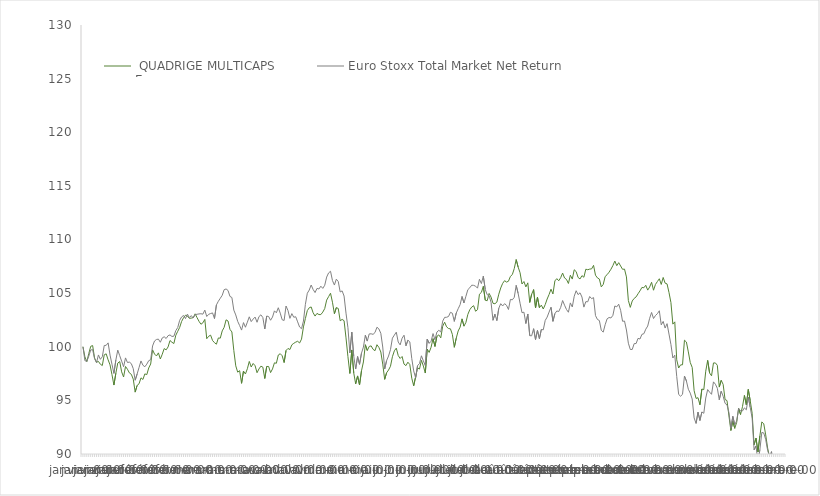
| Category |   QUADRIGE MULTICAPS
Europe  |  Euro Stoxx Total Market Net Return  |
|---|---|---|
| 0 | 100 | 100 |
| 1900-01-01 | 99.06 | 98.703 |
| 1900-01-02 | 98.61 | 98.641 |
| 1900-01-03 | 99.36 | 99.115 |
| 1900-01-04 | 100.04 | 99.701 |
| 1900-01-05 | 100.11 | 99.733 |
| 1900-01-06 | 98.95 | 98.884 |
| 1900-01-07 | 98.56 | 98.515 |
| 1900-01-08 | 98.63 | 99.237 |
| 1900-01-09 | 98.37 | 98.828 |
| 1900-01-10 | 98.25 | 99.066 |
| 1900-01-11 | 99.25 | 100.118 |
| 1900-01-12 | 99.34 | 100.132 |
| 1900-01-13 | 98.78 | 100.36 |
| 1900-01-14 | 98.31 | 99.224 |
| 1900-01-15 | 97.4 | 98.368 |
| 1900-01-16 | 96.43 | 97.516 |
| 1900-01-17 | 97.53 | 98.762 |
| 1900-01-18 | 98.48 | 99.688 |
| 1900-01-19 | 98.62 | 99.167 |
| 1900-01-20 | 97.66 | 98.655 |
| 1900-01-21 | 97.18 | 98.136 |
| 1900-01-22 | 98.16 | 98.96 |
| 1900-01-23 | 97.9 | 98.532 |
| 1900-01-24 | 97.56 | 98.568 |
| 1900-01-25 | 97.43 | 98.426 |
| 1900-01-26 | 96.98 | 97.956 |
| 1900-01-27 | 95.77 | 96.879 |
| 1900-01-28 | 96.39 | 97.457 |
| 1900-01-29 | 96.55 | 98.07 |
| 1900-01-30 | 97.1 | 98.676 |
| 1900-01-31 | 96.95 | 98.273 |
| 1900-02-01 | 97.47 | 98.135 |
| 1900-02-02 | 97.4 | 98.378 |
| 1900-02-03 | 98.02 | 98.701 |
| 1900-02-04 | 98.39 | 98.793 |
| 1900-02-05 | 99.71 | 100.074 |
| 1900-02-06 | 99.32 | 100.537 |
| 1900-02-07 | 99.14 | 100.678 |
| 1900-02-08 | 99.43 | 100.711 |
| 1900-02-09 | 98.86 | 100.421 |
| 1900-02-10 | 99.3 | 100.822 |
| 1900-02-11 | 99.83 | 100.93 |
| 1900-02-12 | 99.71 | 100.767 |
| 1900-02-13 | 99.98 | 101.032 |
| 1900-02-14 | 100.58 | 101.103 |
| 1900-02-15 | 100.42 | 100.959 |
| 1900-02-16 | 100.3 | 100.984 |
| 1900-02-17 | 101.07 | 101.507 |
| 1900-02-18 | 101.44 | 101.791 |
| 1900-02-19 | 101.8 | 102.463 |
| 1900-02-20 | 102.36 | 102.781 |
| 1900-02-21 | 102.7 | 102.917 |
| 1900-02-22 | 102.94 | 102.624 |
| 1900-02-23 | 102.87 | 103.045 |
| 1900-02-24 | 102.65 | 102.719 |
| 1900-02-25 | 102.67 | 102.903 |
| 1900-02-26 | 102.71 | 102.68 |
| 1900-02-27 | 103.07 | 102.993 |
| 1900-02-28 | 102.71 | 103.029 |
| 1900-02-28 | 102.37 | 103.062 |
| 1900-03-01 | 102.1 | 103.077 |
| 1900-03-02 | 102.23 | 103.04 |
| 1900-03-03 | 102.55 | 103.417 |
| 1900-03-04 | 100.75 | 102.821 |
| 1900-03-05 | 100.98 | 103.023 |
| 1900-03-06 | 101.08 | 103.097 |
| 1900-03-07 | 100.58 | 103.153 |
| 1900-03-08 | 100.38 | 102.63 |
| 1900-03-09 | 100.24 | 103.903 |
| 1900-03-10 | 100.82 | 104.241 |
| 1900-03-11 | 100.8 | 104.52 |
| 1900-03-12 | 101.48 | 104.8 |
| 1900-03-13 | 101.81 | 105.323 |
| 1900-03-14 | 102.51 | 105.388 |
| 1900-03-15 | 102.4 | 105.248 |
| 1900-03-16 | 101.62 | 104.693 |
| 1900-03-17 | 101.38 | 104.593 |
| 1900-03-18 | 99.65 | 103.417 |
| 1900-03-19 | 98.22 | 102.965 |
| 1900-03-20 | 97.63 | 102.366 |
| 1900-03-21 | 97.77 | 101.977 |
| 1900-03-22 | 96.59 | 101.553 |
| 1900-03-23 | 97.73 | 102.25 |
| 1900-03-24 | 97.46 | 101.819 |
| 1900-03-25 | 97.95 | 102.292 |
| 1900-03-26 | 98.63 | 102.79 |
| 1900-03-27 | 98.11 | 102.345 |
| 1900-03-28 | 98.44 | 102.582 |
| 1900-03-29 | 98.23 | 102.767 |
| 1900-03-30 | 97.58 | 102.284 |
| 1900-03-31 | 97.93 | 102.81 |
| 1900-04-01 | 98.19 | 102.976 |
| 1900-04-02 | 98.1 | 102.728 |
| 1900-04-03 | 97.04 | 101.657 |
| 1900-04-04 | 98.16 | 102.863 |
| 1900-04-05 | 98.16 | 102.818 |
| 1900-04-06 | 97.59 | 102.472 |
| 1900-04-07 | 97.93 | 102.767 |
| 1900-04-08 | 98.5 | 103.346 |
| 1900-04-09 | 98.46 | 103.167 |
| 1900-04-10 | 99.23 | 103.637 |
| 1900-04-11 | 99.35 | 103.133 |
| 1900-04-12 | 99.16 | 102.514 |
| 1900-04-13 | 98.53 | 102.452 |
| 1900-04-14 | 99.65 | 103.799 |
| 1900-04-15 | 99.84 | 103.377 |
| 1900-04-16 | 99.74 | 102.646 |
| 1900-04-17 | 100.18 | 103.09 |
| 1900-04-18 | 100.32 | 102.75 |
| 1900-04-19 | 100.43 | 102.798 |
| 1900-04-20 | 100.51 | 102.32 |
| 1900-04-21 | 100.35 | 101.839 |
| 1900-04-22 | 100.71 | 101.684 |
| 1900-04-23 | 101.85 | 102.398 |
| 1900-04-24 | 102.63 | 103.948 |
| 1900-04-25 | 103.37 | 104.989 |
| 1900-04-26 | 103.64 | 105.288 |
| 1900-04-27 | 103.71 | 105.756 |
| 1900-04-28 | 103.17 | 105.34 |
| 1900-04-29 | 102.86 | 105.051 |
| 1900-04-30 | 103.11 | 105.439 |
| 1900-05-01 | 103 | 105.385 |
| 1900-05-02 | 103 | 105.645 |
| 1900-05-03 | 103.23 | 105.442 |
| 1900-05-04 | 103.56 | 105.732 |
| 1900-05-05 | 104.35 | 106.497 |
| 1900-05-06 | 104.67 | 106.884 |
| 1900-05-07 | 104.99 | 107.039 |
| 1900-05-08 | 104.15 | 106.173 |
| 1900-05-09 | 103.08 | 105.754 |
| 1900-05-10 | 103.65 | 106.302 |
| 1900-05-11 | 103.57 | 106.081 |
| 1900-05-12 | 102.42 | 105.105 |
| 1900-05-13 | 102.55 | 105.208 |
| 1900-05-14 | 102.43 | 104.727 |
| 1900-05-15 | 100.83 | 103.133 |
| 1900-05-16 | 99.08 | 101.78 |
| 1900-05-17 | 97.51 | 99.427 |
| 1900-05-18 | 99.7 | 101.361 |
| 1900-05-19 | 97.56 | 99.123 |
| 1900-05-20 | 96.54 | 97.924 |
| 1900-05-21 | 97.28 | 99.089 |
| 1900-05-22 | 96.44 | 98.363 |
| 1900-05-23 | 97.75 | 99.401 |
| 1900-05-24 | 98.58 | 99.971 |
| 1900-05-25 | 100.19 | 101.074 |
| 1900-05-26 | 99.65 | 100.528 |
| 1900-05-27 | 100.03 | 101.196 |
| 1900-05-28 | 100.08 | 101.207 |
| 1900-05-29 | 99.76 | 101.156 |
| 1900-05-30 | 99.63 | 101.33 |
| 1900-05-31 | 100.19 | 101.82 |
| 1900-06-01 | 99.94 | 101.664 |
| 1900-06-02 | 99.51 | 101.252 |
| 1900-06-03 | 98.38 | 99.975 |
| 1900-06-04 | 96.96 | 97.922 |
| 1900-06-05 | 97.58 | 98.714 |
| 1900-06-06 | 97.83 | 99.136 |
| 1900-06-07 | 98.18 | 99.728 |
| 1900-06-08 | 99.07 | 100.802 |
| 1900-06-09 | 99.62 | 101.086 |
| 1900-06-10 | 99.87 | 101.359 |
| 1900-06-11 | 99.18 | 100.438 |
| 1900-06-12 | 98.91 | 100.172 |
| 1900-06-13 | 99.09 | 100.793 |
| 1900-06-14 | 98.38 | 101.075 |
| 1900-06-15 | 98.24 | 100.087 |
| 1900-06-16 | 98.56 | 100.613 |
| 1900-06-17 | 98.34 | 100.452 |
| 1900-06-18 | 97.07 | 98.908 |
| 1900-06-19 | 96.36 | 97.748 |
| 1900-06-20 | 97.2 | 97.1 |
| 1900-06-21 | 98.03 | 98.236 |
| 1900-06-22 | 97.92 | 98.434 |
| 1900-06-23 | 98.73 | 99.157 |
| 1900-06-24 | 98.2 | 98.679 |
| 1900-06-25 | 97.55 | 98.256 |
| 1900-06-26 | 99.79 | 100.714 |
| 1900-06-27 | 99.47 | 100.321 |
| 1900-06-28 | 99.96 | 100.512 |
| 1900-06-29 | 100.76 | 101.229 |
| 1900-06-30 | 100.03 | 100.649 |
| 1900-07-01 | 100.97 | 101.372 |
| 1900-07-02 | 101.11 | 101.533 |
| 1900-07-03 | 100.83 | 101.378 |
| 1900-07-04 | 101.92 | 102.393 |
| 1900-07-05 | 102.29 | 102.739 |
| 1900-07-06 | 101.86 | 102.748 |
| 1900-07-07 | 101.7 | 102.821 |
| 1900-07-08 | 101.67 | 103.211 |
| 1900-07-09 | 101.15 | 103.127 |
| 1900-07-10 | 99.95 | 102.365 |
| 1900-07-11 | 100.8 | 103.141 |
| 1900-07-12 | 101.47 | 103.549 |
| 1900-07-13 | 101.83 | 103.921 |
| 1900-07-14 | 102.6 | 104.689 |
| 1900-07-15 | 101.92 | 104.078 |
| 1900-07-16 | 102.27 | 104.705 |
| 1900-07-17 | 103.02 | 105.324 |
| 1900-07-18 | 103.45 | 105.498 |
| 1900-07-19 | 103.7 | 105.74 |
| 1900-07-20 | 103.83 | 105.725 |
| 1900-07-21 | 103.31 | 105.648 |
| 1900-07-22 | 103.46 | 105.464 |
| 1900-07-23 | 104.9 | 106.291 |
| 1900-07-24 | 105.07 | 105.891 |
| 1900-07-25 | 105.63 | 106.583 |
| 1900-07-26 | 104.34 | 105.347 |
| 1900-07-27 | 104.29 | 104.849 |
| 1900-07-28 | 104.97 | 104.762 |
| 1900-07-29 | 104.63 | 104.142 |
| 1900-07-30 | 104.05 | 102.469 |
| 1900-07-31 | 104.01 | 103.048 |
| 1900-08-01 | 104.16 | 102.436 |
| 1900-08-02 | 104.9 | 103.588 |
| 1900-08-03 | 105.48 | 104.014 |
| 1900-08-04 | 105.91 | 103.802 |
| 1900-08-05 | 106.16 | 104.016 |
| 1900-08-06 | 106.03 | 103.862 |
| 1900-08-07 | 106.11 | 103.474 |
| 1900-08-08 | 106.56 | 104.412 |
| 1900-08-09 | 106.73 | 104.378 |
| 1900-08-10 | 107.29 | 104.606 |
| 1900-08-11 | 108.13 | 105.72 |
| 1900-08-12 | 107.43 | 104.973 |
| 1900-08-13 | 106.9 | 104.058 |
| 1900-08-14 | 105.85 | 103.172 |
| 1900-08-15 | 106.08 | 103.223 |
| 1900-08-16 | 105.58 | 102.165 |
| 1900-08-17 | 105.96 | 103.054 |
| 1900-08-18 | 104.13 | 101.033 |
| 1900-08-19 | 104.9 | 101.021 |
| 1900-08-20 | 105.33 | 101.684 |
| 1900-08-21 | 103.62 | 100.672 |
| 1900-08-22 | 104.62 | 101.529 |
| 1900-08-23 | 103.64 | 100.754 |
| 1900-08-24 | 103.88 | 101.614 |
| 1900-08-25 | 103.52 | 101.577 |
| 1900-08-26 | 103.93 | 102.453 |
| 1900-08-27 | 104.45 | 102.764 |
| 1900-08-28 | 104.87 | 103.232 |
| 1900-08-29 | 105.37 | 103.682 |
| 1900-08-30 | 104.92 | 102.37 |
| 1900-08-31 | 106.14 | 103.088 |
| 1900-09-01 | 106.35 | 103.338 |
| 1900-09-02 | 106.15 | 103.284 |
| 1900-09-03 | 106.44 | 103.672 |
| 1900-09-04 | 106.87 | 104.309 |
| 1900-09-05 | 106.41 | 103.873 |
| 1900-09-06 | 106.28 | 103.478 |
| 1900-09-07 | 105.9 | 103.217 |
| 1900-09-08 | 106.67 | 104.089 |
| 1900-09-09 | 106.31 | 103.71 |
| 1900-09-10 | 107.18 | 104.71 |
| 1900-09-11 | 107.01 | 105.223 |
| 1900-09-12 | 106.46 | 104.86 |
| 1900-09-13 | 106.32 | 105.029 |
| 1900-09-14 | 106.63 | 104.635 |
| 1900-09-15 | 106.48 | 103.695 |
| 1900-09-16 | 107.23 | 104.204 |
| 1900-09-17 | 107.18 | 104.193 |
| 1900-09-18 | 107.24 | 104.685 |
| 1900-09-19 | 107.26 | 104.483 |
| 1900-09-20 | 107.59 | 104.581 |
| 1900-09-21 | 106.67 | 102.905 |
| 1900-09-22 | 106.42 | 102.546 |
| 1900-09-23 | 106.31 | 102.444 |
| 1900-09-24 | 105.58 | 101.533 |
| 1900-09-25 | 105.81 | 101.364 |
| 1900-09-26 | 106.55 | 102.056 |
| 1900-09-27 | 106.72 | 102.602 |
| 1900-09-28 | 106.95 | 102.728 |
| 1900-09-29 | 107.23 | 102.685 |
| 1900-09-30 | 107.57 | 102.928 |
| 1900-10-01 | 107.99 | 103.8 |
| 1900-10-02 | 107.56 | 103.723 |
| 1900-10-03 | 107.84 | 103.968 |
| 1900-10-04 | 107.53 | 103.394 |
| 1900-10-05 | 107.22 | 102.374 |
| 1900-10-06 | 107.24 | 102.396 |
| 1900-10-07 | 106.51 | 101.561 |
| 1900-10-08 | 104.31 | 100.329 |
| 1900-10-09 | 103.67 | 99.742 |
| 1900-10-10 | 104.27 | 99.749 |
| 1900-10-11 | 104.51 | 100.29 |
| 1900-10-12 | 104.65 | 100.303 |
| 1900-10-13 | 104.94 | 100.784 |
| 1900-10-14 | 105.21 | 100.722 |
| 1900-10-15 | 105.53 | 101.155 |
| 1900-10-16 | 105.5 | 101.215 |
| 1900-10-17 | 105.73 | 101.639 |
| 1900-10-18 | 105.28 | 101.929 |
| 1900-10-19 | 105.57 | 102.654 |
| 1900-10-20 | 106.01 | 103.197 |
| 1900-10-21 | 105.27 | 102.632 |
| 1900-10-22 | 105.81 | 102.908 |
| 1900-10-23 | 106.08 | 103.082 |
| 1900-10-24 | 106.34 | 103.357 |
| 1900-10-25 | 105.81 | 102.041 |
| 1900-10-26 | 106.46 | 102.362 |
| 1900-10-27 | 105.93 | 101.743 |
| 1900-10-28 | 105.86 | 102.152 |
| 1900-10-29 | 105.06 | 101.184 |
| 1900-10-30 | 104.12 | 100.214 |
| 1900-10-31 | 102.11 | 98.951 |
| 1900-11-01 | 102.32 | 99.215 |
| 1900-11-02 | 98.78 | 97.233 |
| 1900-11-03 | 98.02 | 95.553 |
| 1900-11-04 | 98.31 | 95.39 |
| 1900-11-05 | 98.32 | 95.563 |
| 1900-11-06 | 100.61 | 97.263 |
| 1900-11-07 | 100.44 | 96.813 |
| 1900-11-08 | 99.52 | 96.038 |
| 1900-11-09 | 98.53 | 95.675 |
| 1900-11-10 | 98.07 | 95.126 |
| 1900-11-11 | 95.9 | 93.363 |
| 1900-11-12 | 95.18 | 92.852 |
| 1900-11-13 | 95.25 | 93.901 |
| 1900-11-14 | 94.59 | 93.127 |
| 1900-11-15 | 96.06 | 93.92 |
| 1900-11-16 | 96 | 93.796 |
| 1900-11-17 | 97.72 | 95.217 |
| 1900-11-18 | 98.73 | 96.007 |
| 1900-11-19 | 97.55 | 95.767 |
| 1900-11-20 | 97.29 | 95.567 |
| 1900-11-21 | 98.49 | 96.726 |
| 1900-11-22 | 98.49 | 96.504 |
| 1900-11-23 | 98.27 | 96.127 |
| 1900-11-24 | 96.24 | 95.061 |
| 1900-11-25 | 96.87 | 95.852 |
| 1900-11-26 | 96.49 | 95.385 |
| 1900-11-27 | 95.08 | 94.725 |
| 1900-11-28 | 94.98 | 94.584 |
| 1900-11-29 | 93.55 | 93.856 |
| 1900-11-30 | 92.19 | 92.399 |
| 1900-12-01 | 93.08 | 93.51 |
| 1900-12-02 | 92.39 | 92.736 |
| 1900-12-03 | 92.95 | 93.087 |
| 1900-12-04 | 94.25 | 94.246 |
| 1900-12-05 | 93.68 | 94.024 |
| 1900-12-06 | 94.41 | 94.012 |
| 1900-12-07 | 95.46 | 94.299 |
| 1900-12-08 | 94.58 | 94.12 |
| 1900-12-09 | 96.02 | 95.317 |
| 1900-12-10 | 94.97 | 94.345 |
| 1900-12-11 | 93.8 | 93.348 |
| 1900-12-12 | 90.86 | 90.387 |
| 1900-12-13 | 91.48 | 90.75 |
| 1900-12-14 | 90.19 | 89.266 |
| 1900-12-15 | 91.69 | 90.407 |
| 1900-12-16 | 92.99 | 92.015 |
| 1900-12-17 | 92.82 | 91.96 |
| 1900-12-18 | 91.78 | 91.352 |
| 1900-12-19 | 90.55 | 90.34 |
| 1900-12-20 | 89.72 | 89.78 |
| 1900-12-21 | 89.89 | 90.22 |
| 1900-12-22 | 87.91 | 88.59 |
| 1900-12-23 | 87.89 | 88.46 |
| 1900-12-24 | 87.35 | 87.88 |
| 1900-12-25 | 86.83 | 86.72 |
| 1900-12-26 | 88.5 | 88.16 |
| 1900-12-27 | 89.08 | 88.65 |
| 1900-12-28 | 88.97 | 88.47 |